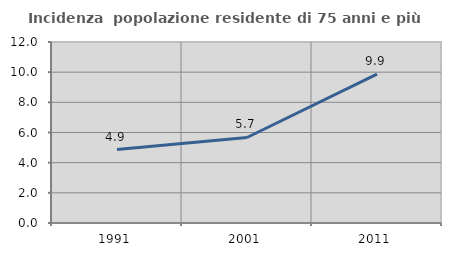
| Category | Incidenza  popolazione residente di 75 anni e più |
|---|---|
| 1991.0 | 4.871 |
| 2001.0 | 5.669 |
| 2011.0 | 9.873 |